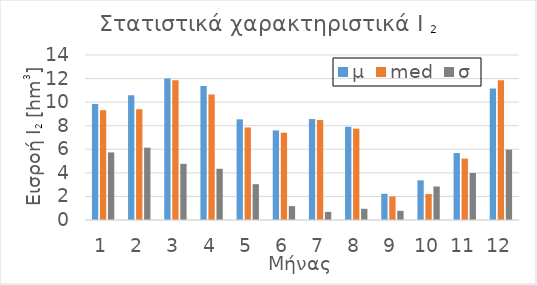
| Category | μ | med | σ |
|---|---|---|---|
| 0 | 9.849 | 9.319 | 5.734 |
| 1 | 10.584 | 9.397 | 6.135 |
| 2 | 11.996 | 11.868 | 4.764 |
| 3 | 11.372 | 10.652 | 4.345 |
| 4 | 8.541 | 7.85 | 3.037 |
| 5 | 7.6 | 7.406 | 1.178 |
| 6 | 8.566 | 8.483 | 0.691 |
| 7 | 7.905 | 7.752 | 0.954 |
| 8 | 2.225 | 1.996 | 0.773 |
| 9 | 3.367 | 2.208 | 2.842 |
| 10 | 5.681 | 5.209 | 3.987 |
| 11 | 11.16 | 11.857 | 5.969 |